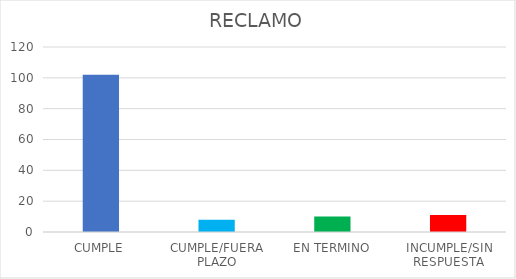
| Category | TOTAL |
|---|---|
| CUMPLE | 102 |
| CUMPLE/FUERA PLAZO | 8 |
| EN TERMINO | 10 |
| INCUMPLE/SIN RESPUESTA | 11 |